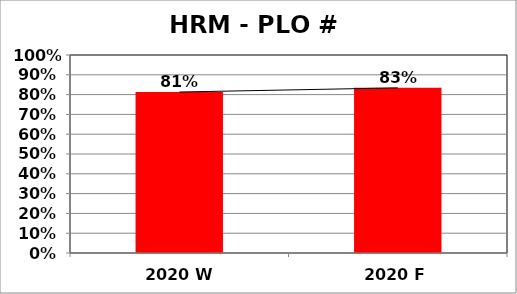
| Category | Series 0 |
|---|---|
| 2020 W | 0.813 |
| 2020 F | 0.834 |